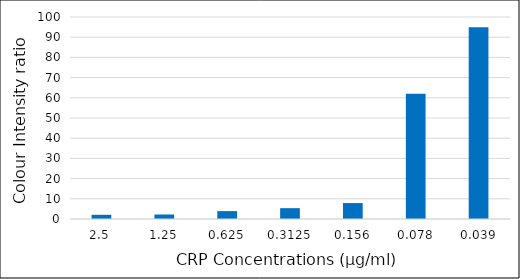
| Category | Series 1 |
|---|---|
| 2.5 | 2.077 |
| 1.25 | 2.222 |
| 0.625 | 3.9 |
| 0.3125 | 5.361 |
| 0.156 | 7.886 |
| 0.078 | 62.058 |
| 0.039 | 94.967 |